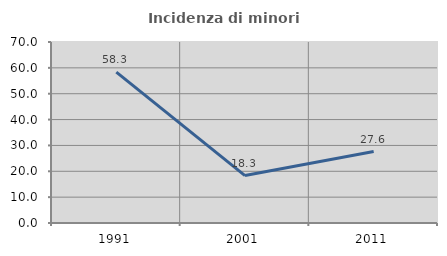
| Category | Incidenza di minori stranieri |
|---|---|
| 1991.0 | 58.333 |
| 2001.0 | 18.333 |
| 2011.0 | 27.619 |